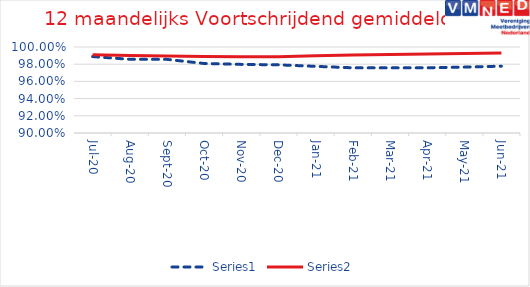
| Category | Series 0 | Series 1 |
|---|---|---|
| 2020-07-01 | 0.989 | 0.991 |
| 2020-08-01 | 0.986 | 0.99 |
| 2020-09-01 | 0.986 | 0.99 |
| 2020-10-01 | 0.981 | 0.989 |
| 2020-11-01 | 0.98 | 0.989 |
| 2020-12-01 | 0.979 | 0.989 |
| 2021-01-01 | 0.978 | 0.99 |
| 2021-02-01 | 0.976 | 0.991 |
| 2021-03-01 | 0.976 | 0.991 |
| 2021-04-01 | 0.976 | 0.992 |
| 2021-05-01 | 0.977 | 0.992 |
| 2021-06-01 | 0.978 | 0.993 |